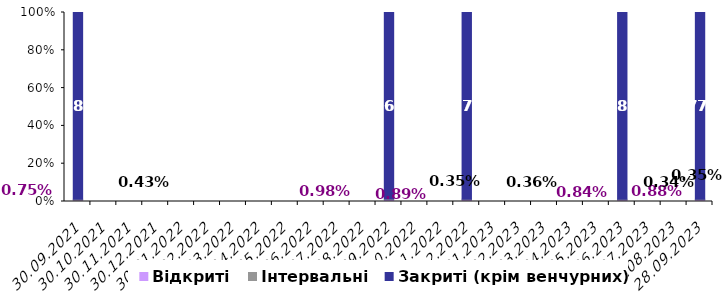
| Category | Відкриті | Інтервальні | Закриті (крім венчурних) |
|---|---|---|---|
| 2021-09-30 | 0.008 | 0.004 | 0.988 |
| 2022-09-30 | 0.01 | 0.004 | 0.987 |
| 2022-12-31 | 0.009 | 0.004 | 0.988 |
| 2023-06-30 | 0.008 | 0.003 | 0.988 |
| 2023-09-30 | 0.009 | 0.004 | 0.988 |